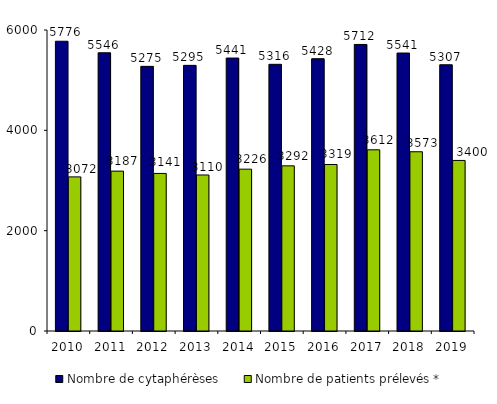
| Category | Nombre de cytaphérèses | Nombre de patients prélevés * |
|---|---|---|
| 2010.0 | 5776 | 3072 |
| 2011.0 | 5546 | 3187 |
| 2012.0 | 5275 | 3141 |
| 2013.0 | 5295 | 3110 |
| 2014.0 | 5441 | 3226 |
| 2015.0 | 5316 | 3292 |
| 2016.0 | 5428 | 3319 |
| 2017.0 | 5712 | 3612 |
| 2018.0 | 5541 | 3573 |
| 2019.0 | 5307 | 3400 |